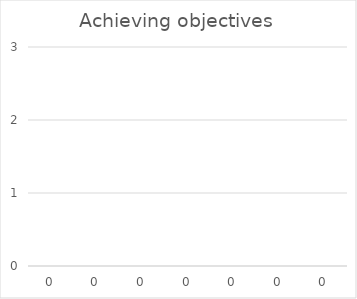
| Category | Achieving objectives |
|---|---|
| 0.0 | 0 |
| 0.0 | 0 |
| 0.0 | 0 |
| 0.0 | 0 |
| 0.0 | 0 |
| 0.0 | 0 |
| 0.0 | 0 |